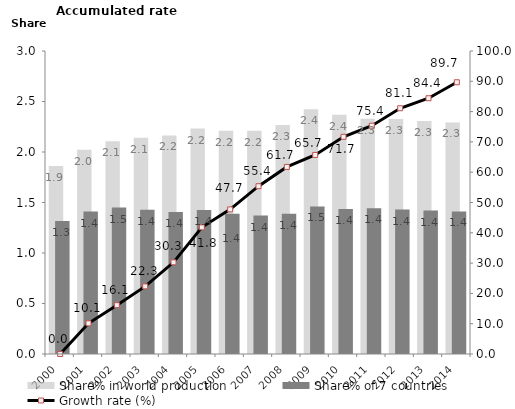
| Category | Share% in world production | Share% of 7 countries |
|---|---|---|
| 2000.0 | 1.863 | 1.317 |
| 2001.0 | 2.023 | 1.41 |
| 2002.0 | 2.108 | 1.45 |
| 2003.0 | 2.141 | 1.429 |
| 2004.0 | 2.163 | 1.406 |
| 2005.0 | 2.232 | 1.425 |
| 2006.0 | 2.21 | 1.388 |
| 2007.0 | 2.211 | 1.371 |
| 2008.0 | 2.266 | 1.389 |
| 2009.0 | 2.423 | 1.461 |
| 2010.0 | 2.369 | 1.436 |
| 2011.0 | 2.329 | 1.442 |
| 2012.0 | 2.327 | 1.43 |
| 2013.0 | 2.306 | 1.421 |
| 2014.0 | 2.293 | 1.411 |